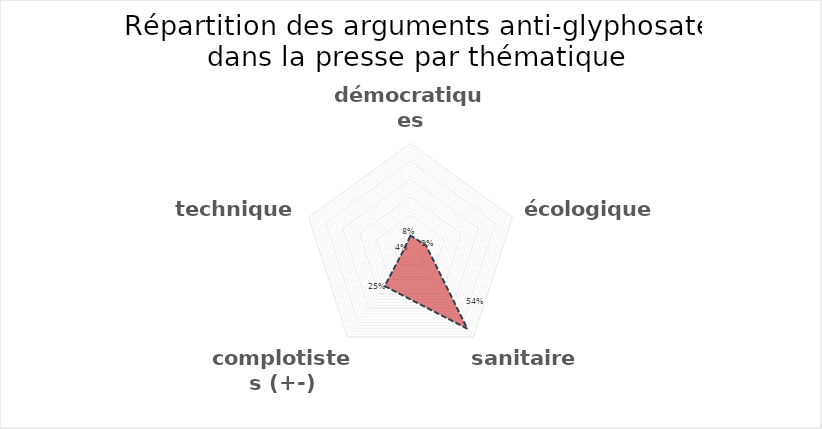
| Category | Series 0 |
|---|---|
| démocratiques | 0.085 |
| écologiques | 0.092 |
| sanitaires | 0.542 |
| complotistes (+-) | 0.246 |
| techniques | 0.035 |